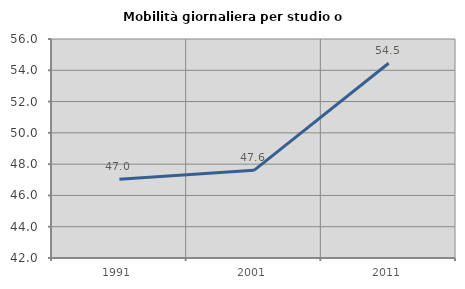
| Category | Mobilità giornaliera per studio o lavoro |
|---|---|
| 1991.0 | 47.031 |
| 2001.0 | 47.606 |
| 2011.0 | 54.453 |